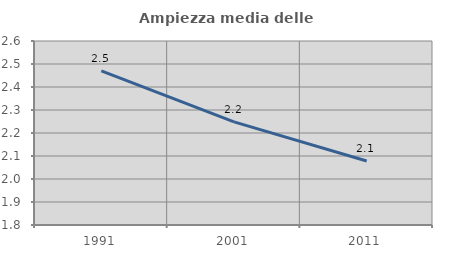
| Category | Ampiezza media delle famiglie |
|---|---|
| 1991.0 | 2.47 |
| 2001.0 | 2.248 |
| 2011.0 | 2.078 |